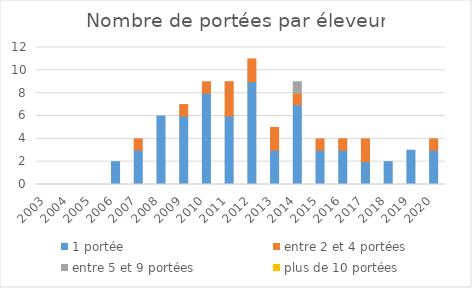
| Category | 1 portée | entre 2 et 4 portées | entre 5 et 9 portées | plus de 10 portées |
|---|---|---|---|---|
| 2003.0 | 0 | 0 | 0 | 0 |
| 2004.0 | 0 | 0 | 0 | 0 |
| 2005.0 | 0 | 0 | 0 | 0 |
| 2006.0 | 2 | 0 | 0 | 0 |
| 2007.0 | 3 | 1 | 0 | 0 |
| 2008.0 | 6 | 0 | 0 | 0 |
| 2009.0 | 6 | 1 | 0 | 0 |
| 2010.0 | 8 | 1 | 0 | 0 |
| 2011.0 | 6 | 3 | 0 | 0 |
| 2012.0 | 9 | 2 | 0 | 0 |
| 2013.0 | 3 | 2 | 0 | 0 |
| 2014.0 | 7 | 1 | 1 | 0 |
| 2015.0 | 3 | 1 | 0 | 0 |
| 2016.0 | 3 | 1 | 0 | 0 |
| 2017.0 | 2 | 2 | 0 | 0 |
| 2018.0 | 2 | 0 | 0 | 0 |
| 2019.0 | 3 | 0 | 0 | 0 |
| 2020.0 | 3 | 1 | 0 | 0 |